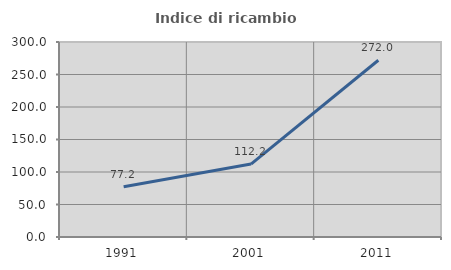
| Category | Indice di ricambio occupazionale  |
|---|---|
| 1991.0 | 77.16 |
| 2001.0 | 112.214 |
| 2011.0 | 271.951 |